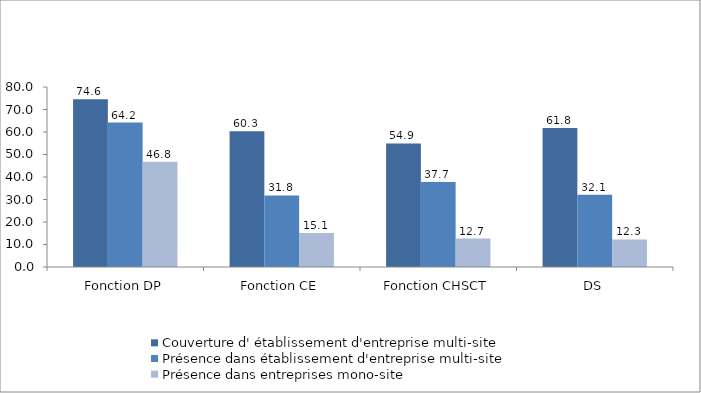
| Category | Couverture d' établissement d'entreprise multi-site | Présence dans établissement d'entreprise multi-site | Présence dans entreprises mono-site |
|---|---|---|---|
| Fonction DP | 74.55 | 64.21 | 46.76 |
| Fonction CE | 60.3 | 31.82 | 15.06 |
| Fonction CHSCT | 54.9 | 37.73 | 12.66 |
| DS | 61.8 | 32.1 | 12.26 |